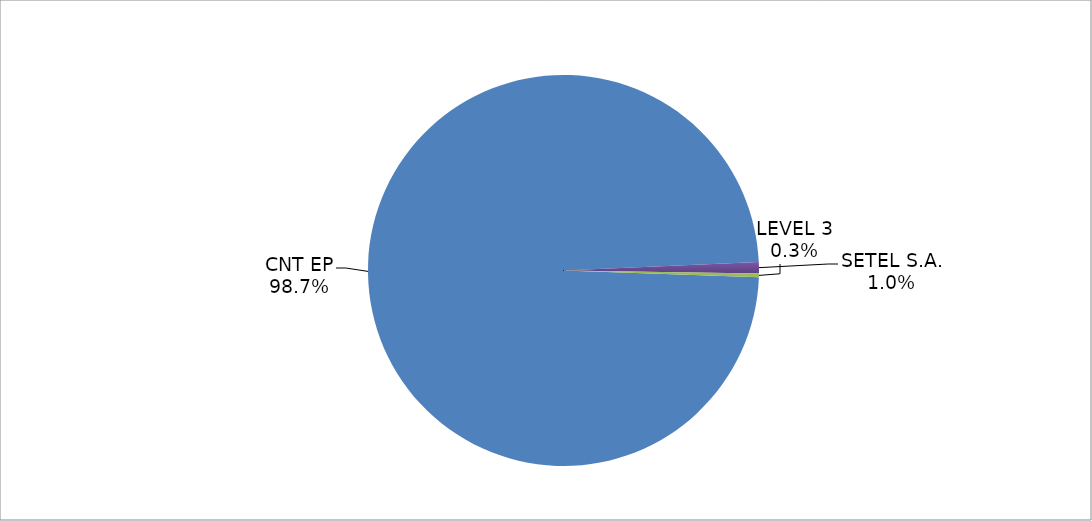
| Category | Series 0 |
|---|---|
| CNT EP | 314 |
| SETEL S.A. | 3 |
| LEVEL 3 | 1 |